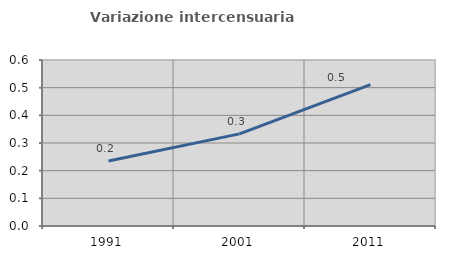
| Category | Variazione intercensuaria annua |
|---|---|
| 1991.0 | 0.235 |
| 2001.0 | 0.333 |
| 2011.0 | 0.511 |